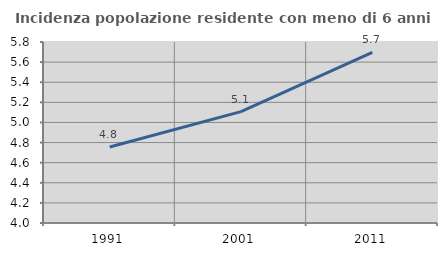
| Category | Incidenza popolazione residente con meno di 6 anni |
|---|---|
| 1991.0 | 4.756 |
| 2001.0 | 5.107 |
| 2011.0 | 5.698 |